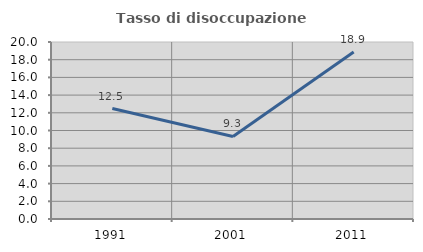
| Category | Tasso di disoccupazione giovanile  |
|---|---|
| 1991.0 | 12.485 |
| 2001.0 | 9.324 |
| 2011.0 | 18.868 |